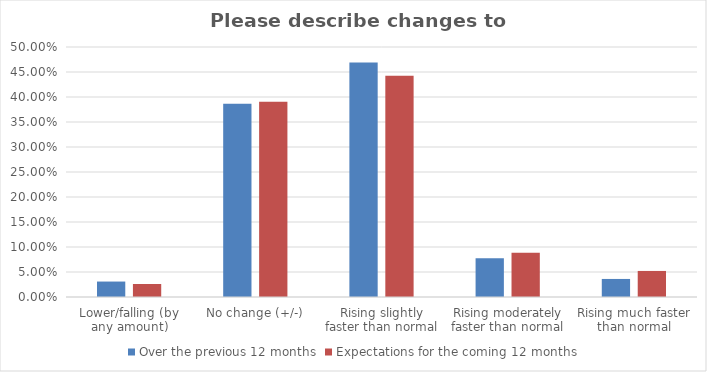
| Category | Over the previous 12 months | Expectations for the coming 12 months |
|---|---|---|
| Lower/falling (by any amount) | 0.031 | 0.026 |
| No change (+/-) | 0.387 | 0.391 |
| Rising slightly faster than normal | 0.469 | 0.443 |
| Rising moderately faster than normal | 0.077 | 0.088 |
| Rising much faster than normal | 0.036 | 0.052 |